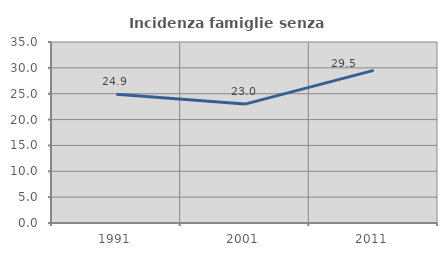
| Category | Incidenza famiglie senza nuclei |
|---|---|
| 1991.0 | 24.88 |
| 2001.0 | 22.991 |
| 2011.0 | 29.505 |